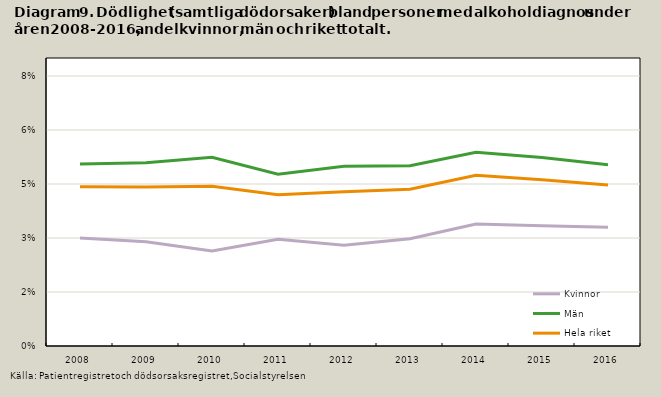
| Category | Kvinnor | Män | Hela riket |
|---|---|---|---|
| 2008.0 | 0.03 | 0.051 | 0.044 |
| 2009.0 | 0.029 | 0.051 | 0.044 |
| 2010.0 | 0.026 | 0.052 | 0.044 |
| 2011.0 | 0.03 | 0.048 | 0.042 |
| 2012.0 | 0.028 | 0.05 | 0.043 |
| 2013.0 | 0.03 | 0.05 | 0.044 |
| 2014.0 | 0.034 | 0.054 | 0.047 |
| 2015.0 | 0.033 | 0.052 | 0.046 |
| 2016.0 | 0.033 | 0.05 | 0.045 |